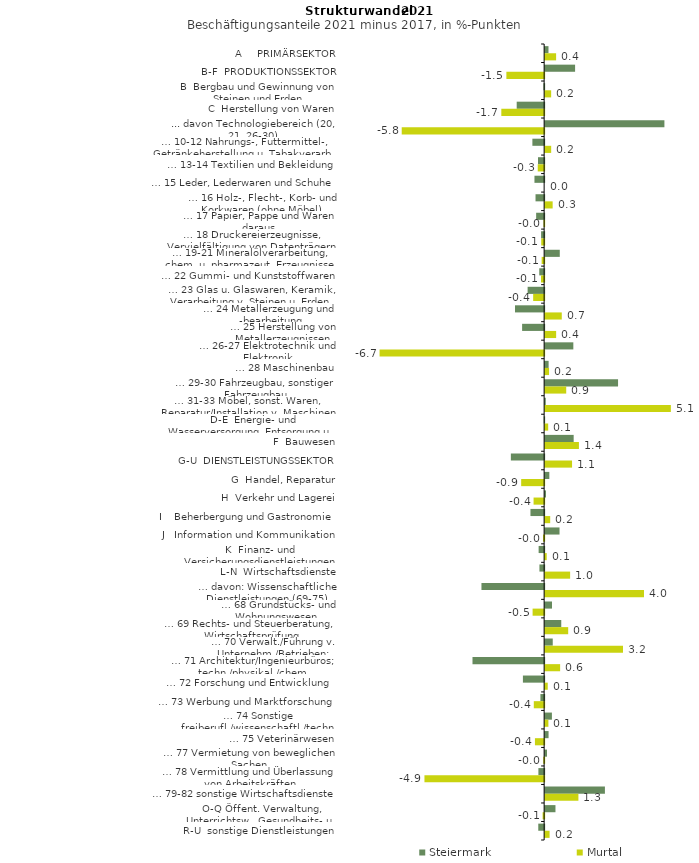
| Category | Steiermark | Murtal |
|---|---|---|
| A     PRIMÄRSEKTOR | 0.135 | 0.445 |
| B-F  PRODUKTIONSSEKTOR | 1.215 | -1.532 |
| B  Bergbau und Gewinnung von Steinen und Erden | -0.029 | 0.244 |
| C  Herstellung von Waren | -1.114 | -1.738 |
| ... davon Technologiebereich (20, 21, 26-30) | 4.84 | -5.78 |
| … 10-12 Nahrungs-, Futtermittel-, Getränkeherstellung u. Tabakverarb. | -0.477 | 0.245 |
| … 13-14 Textilien und Bekleidung | -0.249 | -0.26 |
| … 15 Leder, Lederwaren und Schuhe | -0.393 | 0 |
| … 16 Holz-, Flecht-, Korb- und Korkwaren (ohne Möbel)  | -0.35 | 0.305 |
| … 17 Papier, Pappe und Waren daraus  | -0.325 | -0.027 |
| … 18 Druckereierzeugnisse, Vervielfältigung von Datenträgern | -0.124 | -0.118 |
| … 19-21 Mineralölverarbeitung, chem. u. pharmazeut. Erzeugnisse | 0.594 | -0.101 |
| … 22 Gummi- und Kunststoffwaren | -0.198 | -0.128 |
| … 23 Glas u. Glaswaren, Keramik, Verarbeitung v. Steinen u. Erden  | -0.671 | -0.446 |
| … 24 Metallerzeugung und -bearbeitung | -1.183 | 0.675 |
| … 25 Herstellung von Metallerzeugnissen  | -0.894 | 0.446 |
| … 26-27 Elektrotechnik und Elektronik | 1.144 | -6.678 |
| … 28 Maschinenbau | 0.141 | 0.159 |
| … 29-30 Fahrzeugbau, sonstiger Fahrzeugbau | 2.959 | 0.855 |
| … 31-33 Möbel, sonst. Waren, Reparatur/Installation v. Maschinen | 0.026 | 5.102 |
| D-E  Energie- und Wasserversorgung, Entsorgung u. Rückgewinnung | -0.016 | 0.123 |
| F  Bauwesen | 1.158 | 1.371 |
| G-U  DIENSTLEISTUNGSSEKTOR | -1.351 | 1.092 |
| G  Handel, Reparatur | 0.17 | -0.932 |
| H  Verkehr und Lagerei | 0.036 | -0.429 |
| I    Beherbergung und Gastronomie | -0.556 | 0.205 |
| J   Information und Kommunikation | 0.584 | -0.047 |
| K  Finanz- und Versicherungsdienstleistungen | -0.224 | 0.064 |
| L-N  Wirtschaftsdienste | -0.191 | 1.014 |
| … davon: Wissenschaftliche Dienstleistungen (69-75) | -2.544 | 4.011 |
| … 68 Grundstücks- und Wohnungswesen  | 0.278 | -0.468 |
| … 69 Rechts- und Steuerberatung, Wirtschaftsprüfung | 0.654 | 0.935 |
| … 70 Verwalt./Führung v. Unternehm./Betrieben; Unternehmensberat. | 0.309 | 3.159 |
| … 71 Architektur/Ingenieurbüros; techn./physikal./chem. Untersuchung | -2.908 | 0.608 |
| … 72 Forschung und Entwicklung  | -0.862 | 0.105 |
| … 73 Werbung und Marktforschung | -0.151 | -0.42 |
| … 74 Sonstige freiberufl./wissenschaftl./techn. Tätigkeiten | 0.275 | 0.132 |
| … 75 Veterinärwesen | 0.139 | -0.374 |
| … 77 Vermietung von beweglichen Sachen  | 0.075 | -0.036 |
| … 78 Vermittlung und Überlassung von Arbeitskräften | -0.233 | -4.857 |
| … 79-82 sonstige Wirtschaftsdienste | 2.426 | 1.35 |
| O-Q Öffent. Verwaltung, Unterrichtsw., Gesundheits- u. Sozialwesen | 0.419 | -0.062 |
| R-U  sonstige Dienstleistungen | -0.238 | 0.181 |